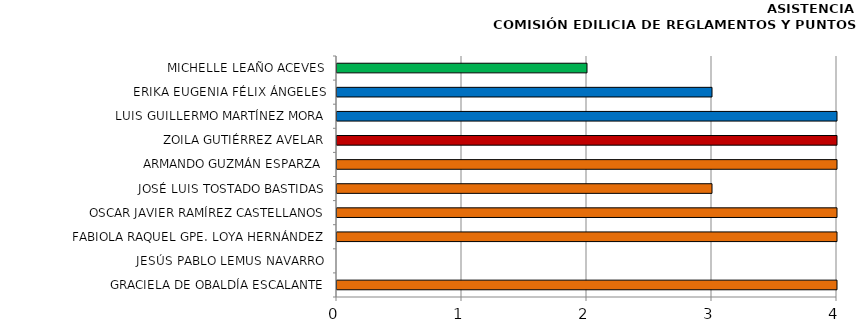
| Category | Series 0 |
|---|---|
| GRACIELA DE OBALDÍA ESCALANTE | 4 |
| JESÚS PABLO LEMUS NAVARRO | 0 |
| FABIOLA RAQUEL GPE. LOYA HERNÁNDEZ | 4 |
| OSCAR JAVIER RAMÍREZ CASTELLANOS | 4 |
| JOSÉ LUIS TOSTADO BASTIDAS | 3 |
| ARMANDO GUZMÁN ESPARZA | 4 |
| ZOILA GUTIÉRREZ AVELAR | 4 |
| LUIS GUILLERMO MARTÍNEZ MORA | 4 |
| ERIKA EUGENIA FÉLIX ÁNGELES | 3 |
| MICHELLE LEAÑO ACEVES | 2 |